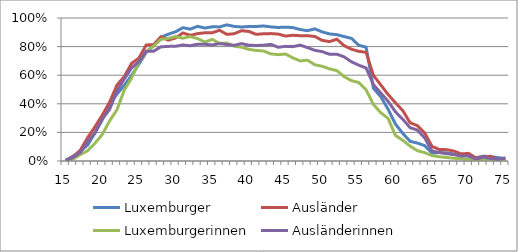
| Category | Luxemburger | Ausländer | Luxemburgerinnen | Ausländerinnen |
|---|---|---|---|---|
| 15.0 | 0.006 | 0.003 | 0.003 | 0.003 |
| 16.0 | 0.033 | 0.028 | 0.013 | 0.024 |
| 17.0 | 0.069 | 0.076 | 0.045 | 0.059 |
| 18.0 | 0.111 | 0.163 | 0.072 | 0.137 |
| 19.0 | 0.196 | 0.239 | 0.125 | 0.198 |
| 20.0 | 0.288 | 0.321 | 0.186 | 0.294 |
| 21.0 | 0.396 | 0.412 | 0.281 | 0.361 |
| 22.0 | 0.468 | 0.53 | 0.358 | 0.49 |
| 23.0 | 0.529 | 0.591 | 0.496 | 0.573 |
| 24.0 | 0.599 | 0.683 | 0.58 | 0.651 |
| 25.0 | 0.677 | 0.72 | 0.693 | 0.695 |
| 26.0 | 0.76 | 0.812 | 0.764 | 0.767 |
| 27.0 | 0.806 | 0.813 | 0.804 | 0.768 |
| 28.0 | 0.866 | 0.869 | 0.851 | 0.798 |
| 29.0 | 0.886 | 0.845 | 0.858 | 0.801 |
| 30.0 | 0.904 | 0.86 | 0.871 | 0.802 |
| 31.0 | 0.932 | 0.896 | 0.859 | 0.811 |
| 32.0 | 0.922 | 0.879 | 0.87 | 0.806 |
| 33.0 | 0.942 | 0.891 | 0.856 | 0.817 |
| 34.0 | 0.93 | 0.896 | 0.832 | 0.816 |
| 35.0 | 0.938 | 0.897 | 0.85 | 0.811 |
| 36.0 | 0.938 | 0.914 | 0.823 | 0.821 |
| 37.0 | 0.952 | 0.886 | 0.825 | 0.815 |
| 38.0 | 0.941 | 0.89 | 0.803 | 0.809 |
| 39.0 | 0.937 | 0.911 | 0.796 | 0.821 |
| 40.0 | 0.94 | 0.906 | 0.781 | 0.81 |
| 41.0 | 0.941 | 0.886 | 0.773 | 0.808 |
| 42.0 | 0.944 | 0.89 | 0.769 | 0.81 |
| 43.0 | 0.938 | 0.891 | 0.749 | 0.816 |
| 44.0 | 0.934 | 0.888 | 0.744 | 0.795 |
| 45.0 | 0.936 | 0.874 | 0.748 | 0.802 |
| 46.0 | 0.933 | 0.879 | 0.721 | 0.8 |
| 47.0 | 0.919 | 0.876 | 0.7 | 0.81 |
| 48.0 | 0.911 | 0.877 | 0.705 | 0.793 |
| 49.0 | 0.924 | 0.871 | 0.673 | 0.774 |
| 50.0 | 0.903 | 0.843 | 0.662 | 0.765 |
| 51.0 | 0.889 | 0.835 | 0.644 | 0.746 |
| 52.0 | 0.883 | 0.852 | 0.632 | 0.747 |
| 53.0 | 0.87 | 0.807 | 0.59 | 0.728 |
| 54.0 | 0.858 | 0.782 | 0.562 | 0.693 |
| 55.0 | 0.809 | 0.767 | 0.549 | 0.67 |
| 56.0 | 0.796 | 0.76 | 0.497 | 0.65 |
| 57.0 | 0.509 | 0.599 | 0.395 | 0.534 |
| 58.0 | 0.45 | 0.532 | 0.338 | 0.476 |
| 59.0 | 0.362 | 0.465 | 0.297 | 0.417 |
| 60.0 | 0.259 | 0.407 | 0.179 | 0.344 |
| 61.0 | 0.193 | 0.353 | 0.145 | 0.292 |
| 62.0 | 0.138 | 0.268 | 0.105 | 0.233 |
| 63.0 | 0.125 | 0.247 | 0.072 | 0.216 |
| 64.0 | 0.108 | 0.196 | 0.058 | 0.161 |
| 65.0 | 0.055 | 0.102 | 0.038 | 0.069 |
| 66.0 | 0.059 | 0.081 | 0.03 | 0.06 |
| 67.0 | 0.057 | 0.079 | 0.025 | 0.051 |
| 68.0 | 0.049 | 0.069 | 0.019 | 0.045 |
| 69.0 | 0.047 | 0.049 | 0.015 | 0.034 |
| 70.0 | 0.034 | 0.053 | 0.01 | 0.035 |
| 71.0 | 0.024 | 0.021 | 0.012 | 0.013 |
| 72.0 | 0.033 | 0.029 | 0.01 | 0.027 |
| 73.0 | 0.031 | 0.033 | 0.007 | 0.018 |
| 74.0 | 0.023 | 0.007 | 0.005 | 0.01 |
| 75.0 | 0.018 | 0.02 | 0.004 | 0.02 |